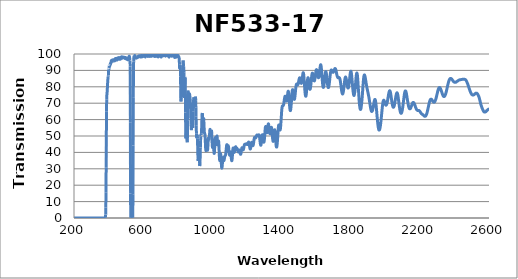
| Category | Transmission (%) |
|---|---|
| 2600.0 | 66.434 |
| 2599.0 | 66.421 |
| 2598.0 | 66.411 |
| 2597.0 | 66.37 |
| 2596.0 | 66.272 |
| 2595.0 | 66.179 |
| 2594.0 | 66.079 |
| 2593.0 | 65.983 |
| 2592.0 | 65.845 |
| 2591.0 | 65.765 |
| 2590.0 | 65.655 |
| 2589.0 | 65.601 |
| 2588.0 | 65.577 |
| 2587.0 | 65.482 |
| 2586.0 | 65.346 |
| 2585.0 | 65.191 |
| 2584.0 | 65.07 |
| 2583.0 | 64.915 |
| 2582.0 | 64.859 |
| 2581.0 | 64.767 |
| 2580.0 | 64.738 |
| 2579.0 | 64.683 |
| 2578.0 | 64.631 |
| 2577.0 | 64.623 |
| 2576.0 | 64.59 |
| 2575.0 | 64.598 |
| 2574.0 | 64.605 |
| 2573.0 | 64.634 |
| 2572.0 | 64.678 |
| 2571.0 | 64.774 |
| 2570.0 | 64.857 |
| 2569.0 | 65.033 |
| 2568.0 | 65.207 |
| 2567.0 | 65.389 |
| 2566.0 | 65.6 |
| 2565.0 | 65.81 |
| 2564.0 | 66.028 |
| 2563.0 | 66.29 |
| 2562.0 | 66.575 |
| 2561.0 | 66.826 |
| 2560.0 | 67.062 |
| 2559.0 | 67.328 |
| 2558.0 | 67.622 |
| 2557.0 | 67.91 |
| 2556.0 | 68.236 |
| 2555.0 | 68.53 |
| 2554.0 | 68.852 |
| 2553.0 | 69.226 |
| 2552.0 | 69.63 |
| 2551.0 | 70.064 |
| 2550.0 | 70.535 |
| 2549.0 | 70.997 |
| 2548.0 | 71.46 |
| 2547.0 | 71.886 |
| 2546.0 | 72.279 |
| 2545.0 | 72.675 |
| 2544.0 | 73.071 |
| 2543.0 | 73.428 |
| 2542.0 | 73.762 |
| 2541.0 | 74.049 |
| 2540.0 | 74.321 |
| 2539.0 | 74.558 |
| 2538.0 | 74.798 |
| 2537.0 | 75.017 |
| 2536.0 | 75.232 |
| 2535.0 | 75.435 |
| 2534.0 | 75.586 |
| 2533.0 | 75.68 |
| 2532.0 | 75.816 |
| 2531.0 | 75.972 |
| 2530.0 | 76.04 |
| 2529.0 | 76.068 |
| 2528.0 | 76.114 |
| 2527.0 | 76.123 |
| 2526.0 | 76.093 |
| 2525.0 | 76.093 |
| 2524.0 | 76.089 |
| 2523.0 | 76.062 |
| 2522.0 | 75.999 |
| 2521.0 | 75.884 |
| 2520.0 | 75.782 |
| 2519.0 | 75.693 |
| 2518.0 | 75.581 |
| 2517.0 | 75.5 |
| 2516.0 | 75.422 |
| 2515.0 | 75.315 |
| 2514.0 | 75.215 |
| 2513.0 | 75.152 |
| 2512.0 | 75.091 |
| 2511.0 | 75.052 |
| 2510.0 | 75.006 |
| 2509.0 | 74.962 |
| 2508.0 | 74.939 |
| 2507.0 | 74.938 |
| 2506.0 | 74.953 |
| 2505.0 | 75.004 |
| 2504.0 | 75.059 |
| 2503.0 | 75.132 |
| 2502.0 | 75.2 |
| 2501.0 | 75.283 |
| 2500.0 | 75.403 |
| 2499.0 | 75.562 |
| 2498.0 | 75.76 |
| 2497.0 | 75.947 |
| 2496.0 | 76.165 |
| 2495.0 | 76.369 |
| 2494.0 | 76.574 |
| 2493.0 | 76.79 |
| 2492.0 | 77.05 |
| 2491.0 | 77.321 |
| 2490.0 | 77.625 |
| 2489.0 | 77.936 |
| 2488.0 | 78.25 |
| 2487.0 | 78.537 |
| 2486.0 | 78.805 |
| 2485.0 | 79.115 |
| 2484.0 | 79.486 |
| 2483.0 | 79.818 |
| 2482.0 | 80.132 |
| 2481.0 | 80.444 |
| 2480.0 | 80.758 |
| 2479.0 | 81.055 |
| 2478.0 | 81.355 |
| 2477.0 | 81.637 |
| 2476.0 | 81.93 |
| 2475.0 | 82.203 |
| 2474.0 | 82.478 |
| 2473.0 | 82.719 |
| 2472.0 | 82.942 |
| 2471.0 | 83.151 |
| 2470.0 | 83.367 |
| 2469.0 | 83.612 |
| 2468.0 | 83.813 |
| 2467.0 | 83.938 |
| 2466.0 | 84.035 |
| 2465.0 | 84.149 |
| 2464.0 | 84.264 |
| 2463.0 | 84.37 |
| 2462.0 | 84.465 |
| 2461.0 | 84.518 |
| 2460.0 | 84.539 |
| 2459.0 | 84.569 |
| 2458.0 | 84.616 |
| 2457.0 | 84.636 |
| 2456.0 | 84.661 |
| 2455.0 | 84.658 |
| 2454.0 | 84.645 |
| 2453.0 | 84.64 |
| 2452.0 | 84.627 |
| 2451.0 | 84.613 |
| 2450.0 | 84.592 |
| 2449.0 | 84.587 |
| 2448.0 | 84.603 |
| 2447.0 | 84.599 |
| 2446.0 | 84.56 |
| 2445.0 | 84.529 |
| 2444.0 | 84.517 |
| 2443.0 | 84.516 |
| 2442.0 | 84.509 |
| 2441.0 | 84.491 |
| 2440.0 | 84.468 |
| 2439.0 | 84.43 |
| 2438.0 | 84.389 |
| 2437.0 | 84.36 |
| 2436.0 | 84.349 |
| 2435.0 | 84.354 |
| 2434.0 | 84.358 |
| 2433.0 | 84.343 |
| 2432.0 | 84.296 |
| 2431.0 | 84.261 |
| 2430.0 | 84.234 |
| 2429.0 | 84.196 |
| 2428.0 | 84.148 |
| 2427.0 | 84.099 |
| 2426.0 | 84.054 |
| 2425.0 | 84.013 |
| 2424.0 | 83.953 |
| 2423.0 | 83.88 |
| 2422.0 | 83.817 |
| 2421.0 | 83.74 |
| 2420.0 | 83.644 |
| 2419.0 | 83.565 |
| 2418.0 | 83.498 |
| 2417.0 | 83.429 |
| 2416.0 | 83.373 |
| 2415.0 | 83.31 |
| 2414.0 | 83.22 |
| 2413.0 | 83.133 |
| 2412.0 | 83.039 |
| 2411.0 | 82.941 |
| 2410.0 | 82.878 |
| 2409.0 | 82.847 |
| 2408.0 | 82.804 |
| 2407.0 | 82.774 |
| 2406.0 | 82.75 |
| 2405.0 | 82.709 |
| 2404.0 | 82.7 |
| 2403.0 | 82.714 |
| 2402.0 | 82.738 |
| 2401.0 | 82.771 |
| 2400.0 | 82.816 |
| 2399.0 | 82.879 |
| 2398.0 | 82.948 |
| 2397.0 | 83.026 |
| 2396.0 | 83.115 |
| 2395.0 | 83.217 |
| 2394.0 | 83.338 |
| 2393.0 | 83.478 |
| 2392.0 | 83.615 |
| 2391.0 | 83.748 |
| 2390.0 | 83.881 |
| 2389.0 | 84.023 |
| 2388.0 | 84.167 |
| 2387.0 | 84.329 |
| 2386.0 | 84.498 |
| 2385.0 | 84.638 |
| 2384.0 | 84.75 |
| 2383.0 | 84.833 |
| 2382.0 | 84.913 |
| 2381.0 | 85.001 |
| 2380.0 | 85.062 |
| 2379.0 | 85.103 |
| 2378.0 | 85.121 |
| 2377.0 | 85.108 |
| 2376.0 | 85.046 |
| 2375.0 | 84.941 |
| 2374.0 | 84.823 |
| 2373.0 | 84.702 |
| 2372.0 | 84.563 |
| 2371.0 | 84.377 |
| 2370.0 | 84.13 |
| 2369.0 | 83.846 |
| 2368.0 | 83.532 |
| 2367.0 | 83.193 |
| 2366.0 | 82.855 |
| 2365.0 | 82.492 |
| 2364.0 | 82.087 |
| 2363.0 | 81.673 |
| 2362.0 | 81.256 |
| 2361.0 | 80.802 |
| 2360.0 | 80.333 |
| 2359.0 | 79.852 |
| 2358.0 | 79.373 |
| 2357.0 | 78.897 |
| 2356.0 | 78.416 |
| 2355.0 | 77.975 |
| 2354.0 | 77.522 |
| 2353.0 | 77.078 |
| 2352.0 | 76.658 |
| 2351.0 | 76.265 |
| 2350.0 | 75.892 |
| 2349.0 | 75.546 |
| 2348.0 | 75.243 |
| 2347.0 | 74.993 |
| 2346.0 | 74.765 |
| 2345.0 | 74.557 |
| 2344.0 | 74.387 |
| 2343.0 | 74.244 |
| 2342.0 | 74.135 |
| 2341.0 | 74.063 |
| 2340.0 | 74.053 |
| 2339.0 | 74.085 |
| 2338.0 | 74.153 |
| 2337.0 | 74.242 |
| 2336.0 | 74.359 |
| 2335.0 | 74.496 |
| 2334.0 | 74.667 |
| 2333.0 | 74.882 |
| 2332.0 | 75.154 |
| 2331.0 | 75.424 |
| 2330.0 | 75.696 |
| 2329.0 | 75.983 |
| 2328.0 | 76.295 |
| 2327.0 | 76.618 |
| 2326.0 | 76.935 |
| 2325.0 | 77.264 |
| 2324.0 | 77.596 |
| 2323.0 | 77.926 |
| 2322.0 | 78.231 |
| 2321.0 | 78.498 |
| 2320.0 | 78.743 |
| 2319.0 | 78.975 |
| 2318.0 | 79.182 |
| 2317.0 | 79.339 |
| 2316.0 | 79.474 |
| 2315.0 | 79.559 |
| 2314.0 | 79.581 |
| 2313.0 | 79.551 |
| 2312.0 | 79.483 |
| 2311.0 | 79.365 |
| 2310.0 | 79.232 |
| 2309.0 | 79.049 |
| 2308.0 | 78.807 |
| 2307.0 | 78.511 |
| 2306.0 | 78.178 |
| 2305.0 | 77.792 |
| 2304.0 | 77.407 |
| 2303.0 | 77.005 |
| 2302.0 | 76.577 |
| 2301.0 | 76.127 |
| 2300.0 | 75.678 |
| 2299.0 | 75.244 |
| 2298.0 | 74.794 |
| 2297.0 | 74.326 |
| 2296.0 | 73.903 |
| 2295.0 | 73.494 |
| 2294.0 | 73.103 |
| 2293.0 | 72.698 |
| 2292.0 | 72.378 |
| 2291.0 | 72.061 |
| 2290.0 | 71.785 |
| 2289.0 | 71.52 |
| 2288.0 | 71.275 |
| 2287.0 | 71.067 |
| 2286.0 | 70.894 |
| 2285.0 | 70.77 |
| 2284.0 | 70.676 |
| 2283.0 | 70.623 |
| 2282.0 | 70.607 |
| 2281.0 | 70.619 |
| 2280.0 | 70.655 |
| 2279.0 | 70.721 |
| 2278.0 | 70.811 |
| 2277.0 | 70.926 |
| 2276.0 | 71.062 |
| 2275.0 | 71.22 |
| 2274.0 | 71.379 |
| 2273.0 | 71.546 |
| 2272.0 | 71.733 |
| 2271.0 | 71.912 |
| 2270.0 | 72.052 |
| 2269.0 | 72.2 |
| 2268.0 | 72.29 |
| 2267.0 | 72.368 |
| 2266.0 | 72.436 |
| 2265.0 | 72.458 |
| 2264.0 | 72.439 |
| 2263.0 | 72.363 |
| 2262.0 | 72.284 |
| 2261.0 | 72.157 |
| 2260.0 | 71.981 |
| 2259.0 | 71.756 |
| 2258.0 | 71.47 |
| 2257.0 | 71.141 |
| 2256.0 | 70.784 |
| 2255.0 | 70.396 |
| 2254.0 | 69.976 |
| 2253.0 | 69.54 |
| 2252.0 | 69.064 |
| 2251.0 | 68.568 |
| 2250.0 | 68.101 |
| 2249.0 | 67.613 |
| 2248.0 | 67.126 |
| 2247.0 | 66.649 |
| 2246.0 | 66.145 |
| 2245.0 | 65.664 |
| 2244.0 | 65.193 |
| 2243.0 | 64.769 |
| 2242.0 | 64.317 |
| 2241.0 | 63.988 |
| 2240.0 | 63.66 |
| 2239.0 | 63.351 |
| 2238.0 | 63.035 |
| 2237.0 | 62.779 |
| 2236.0 | 62.569 |
| 2235.0 | 62.388 |
| 2234.0 | 62.226 |
| 2233.0 | 62.117 |
| 2232.0 | 62.085 |
| 2231.0 | 62.055 |
| 2230.0 | 62.021 |
| 2229.0 | 62.001 |
| 2228.0 | 62.04 |
| 2227.0 | 62.096 |
| 2226.0 | 62.176 |
| 2225.0 | 62.241 |
| 2224.0 | 62.336 |
| 2223.0 | 62.42 |
| 2222.0 | 62.503 |
| 2221.0 | 62.616 |
| 2220.0 | 62.727 |
| 2219.0 | 62.82 |
| 2218.0 | 62.919 |
| 2217.0 | 63.002 |
| 2216.0 | 63.153 |
| 2215.0 | 63.21 |
| 2214.0 | 63.277 |
| 2213.0 | 63.35 |
| 2212.0 | 63.413 |
| 2211.0 | 63.51 |
| 2210.0 | 63.592 |
| 2209.0 | 63.669 |
| 2208.0 | 63.814 |
| 2207.0 | 63.918 |
| 2206.0 | 64.047 |
| 2205.0 | 64.206 |
| 2204.0 | 64.379 |
| 2203.0 | 64.547 |
| 2202.0 | 64.717 |
| 2201.0 | 64.89 |
| 2200.0 | 65.028 |
| 2199.0 | 65.172 |
| 2198.0 | 65.283 |
| 2197.0 | 65.401 |
| 2196.0 | 65.481 |
| 2195.0 | 65.521 |
| 2194.0 | 65.538 |
| 2193.0 | 65.584 |
| 2192.0 | 65.621 |
| 2191.0 | 65.595 |
| 2190.0 | 65.564 |
| 2189.0 | 65.545 |
| 2188.0 | 65.53 |
| 2187.0 | 65.574 |
| 2186.0 | 65.647 |
| 2185.0 | 65.713 |
| 2184.0 | 65.758 |
| 2183.0 | 65.851 |
| 2182.0 | 66.036 |
| 2181.0 | 66.202 |
| 2180.0 | 66.364 |
| 2179.0 | 66.59 |
| 2178.0 | 66.865 |
| 2177.0 | 67.11 |
| 2176.0 | 67.379 |
| 2175.0 | 67.653 |
| 2174.0 | 67.974 |
| 2173.0 | 68.317 |
| 2172.0 | 68.632 |
| 2171.0 | 68.913 |
| 2170.0 | 69.199 |
| 2169.0 | 69.468 |
| 2168.0 | 69.718 |
| 2167.0 | 69.967 |
| 2166.0 | 70.136 |
| 2165.0 | 70.285 |
| 2164.0 | 70.385 |
| 2163.0 | 70.432 |
| 2162.0 | 70.468 |
| 2161.0 | 70.453 |
| 2160.0 | 70.373 |
| 2159.0 | 70.253 |
| 2158.0 | 70.077 |
| 2157.0 | 69.864 |
| 2156.0 | 69.645 |
| 2155.0 | 69.357 |
| 2154.0 | 69.049 |
| 2153.0 | 68.742 |
| 2152.0 | 68.477 |
| 2151.0 | 68.192 |
| 2150.0 | 67.869 |
| 2149.0 | 67.58 |
| 2148.0 | 67.326 |
| 2147.0 | 67.091 |
| 2146.0 | 66.907 |
| 2145.0 | 66.74 |
| 2144.0 | 66.611 |
| 2143.0 | 66.56 |
| 2142.0 | 66.561 |
| 2141.0 | 66.586 |
| 2140.0 | 66.691 |
| 2139.0 | 66.857 |
| 2138.0 | 67.096 |
| 2137.0 | 67.382 |
| 2136.0 | 67.715 |
| 2135.0 | 68.099 |
| 2134.0 | 68.553 |
| 2133.0 | 69.09 |
| 2132.0 | 69.637 |
| 2131.0 | 70.23 |
| 2130.0 | 70.84 |
| 2129.0 | 71.486 |
| 2128.0 | 72.185 |
| 2127.0 | 72.841 |
| 2126.0 | 73.523 |
| 2125.0 | 74.196 |
| 2124.0 | 74.86 |
| 2123.0 | 75.491 |
| 2122.0 | 76.017 |
| 2121.0 | 76.491 |
| 2120.0 | 76.889 |
| 2119.0 | 77.22 |
| 2118.0 | 77.419 |
| 2117.0 | 77.497 |
| 2116.0 | 77.485 |
| 2115.0 | 77.328 |
| 2114.0 | 77.062 |
| 2113.0 | 76.692 |
| 2112.0 | 76.181 |
| 2111.0 | 75.58 |
| 2110.0 | 74.921 |
| 2109.0 | 74.189 |
| 2108.0 | 73.363 |
| 2107.0 | 72.519 |
| 2106.0 | 71.656 |
| 2105.0 | 70.773 |
| 2104.0 | 69.948 |
| 2103.0 | 69.087 |
| 2102.0 | 68.284 |
| 2101.0 | 67.513 |
| 2100.0 | 66.815 |
| 2099.0 | 66.179 |
| 2098.0 | 65.607 |
| 2097.0 | 65.077 |
| 2096.0 | 64.661 |
| 2095.0 | 64.33 |
| 2094.0 | 64.076 |
| 2093.0 | 63.884 |
| 2092.0 | 63.803 |
| 2091.0 | 63.831 |
| 2090.0 | 63.94 |
| 2089.0 | 64.138 |
| 2088.0 | 64.396 |
| 2087.0 | 64.751 |
| 2086.0 | 65.213 |
| 2085.0 | 65.773 |
| 2084.0 | 66.348 |
| 2083.0 | 67.015 |
| 2082.0 | 67.737 |
| 2081.0 | 68.504 |
| 2080.0 | 69.349 |
| 2079.0 | 70.169 |
| 2078.0 | 70.994 |
| 2077.0 | 71.815 |
| 2076.0 | 72.637 |
| 2075.0 | 73.432 |
| 2074.0 | 74.17 |
| 2073.0 | 74.789 |
| 2072.0 | 75.328 |
| 2071.0 | 75.766 |
| 2070.0 | 76.09 |
| 2069.0 | 76.297 |
| 2068.0 | 76.369 |
| 2067.0 | 76.305 |
| 2066.0 | 76.122 |
| 2065.0 | 75.836 |
| 2064.0 | 75.468 |
| 2063.0 | 75.017 |
| 2062.0 | 74.462 |
| 2061.0 | 73.865 |
| 2060.0 | 73.2 |
| 2059.0 | 72.549 |
| 2058.0 | 71.917 |
| 2057.0 | 71.258 |
| 2056.0 | 70.627 |
| 2055.0 | 70.002 |
| 2054.0 | 69.441 |
| 2053.0 | 68.967 |
| 2052.0 | 68.524 |
| 2051.0 | 68.151 |
| 2050.0 | 67.892 |
| 2049.0 | 67.699 |
| 2048.0 | 67.568 |
| 2047.0 | 67.524 |
| 2046.0 | 67.585 |
| 2045.0 | 67.756 |
| 2044.0 | 67.998 |
| 2043.0 | 68.322 |
| 2042.0 | 68.712 |
| 2041.0 | 69.21 |
| 2040.0 | 69.794 |
| 2039.0 | 70.4 |
| 2038.0 | 71.073 |
| 2037.0 | 71.792 |
| 2036.0 | 72.543 |
| 2035.0 | 73.286 |
| 2034.0 | 74.026 |
| 2033.0 | 74.721 |
| 2032.0 | 75.366 |
| 2031.0 | 76.001 |
| 2030.0 | 76.547 |
| 2029.0 | 76.97 |
| 2028.0 | 77.277 |
| 2027.0 | 77.485 |
| 2026.0 | 77.577 |
| 2025.0 | 77.543 |
| 2024.0 | 77.37 |
| 2023.0 | 77.099 |
| 2022.0 | 76.763 |
| 2021.0 | 76.301 |
| 2020.0 | 75.742 |
| 2019.0 | 75.15 |
| 2018.0 | 74.5 |
| 2017.0 | 73.852 |
| 2016.0 | 73.233 |
| 2015.0 | 72.597 |
| 2014.0 | 71.946 |
| 2013.0 | 71.332 |
| 2012.0 | 70.807 |
| 2011.0 | 70.337 |
| 2010.0 | 69.901 |
| 2009.0 | 69.523 |
| 2008.0 | 69.228 |
| 2007.0 | 68.993 |
| 2006.0 | 68.843 |
| 2005.0 | 68.781 |
| 2004.0 | 68.788 |
| 2003.0 | 68.861 |
| 2002.0 | 69.017 |
| 2001.0 | 69.259 |
| 2000.0 | 69.531 |
| 1999.0 | 69.833 |
| 1998.0 | 70.182 |
| 1997.0 | 70.52 |
| 1996.0 | 70.875 |
| 1995.0 | 71.213 |
| 1994.0 | 71.477 |
| 1993.0 | 71.678 |
| 1992.0 | 71.808 |
| 1991.0 | 71.817 |
| 1990.0 | 71.73 |
| 1989.0 | 71.51 |
| 1988.0 | 71.164 |
| 1987.0 | 70.683 |
| 1986.0 | 70.055 |
| 1985.0 | 69.314 |
| 1984.0 | 68.463 |
| 1983.0 | 67.507 |
| 1982.0 | 66.491 |
| 1981.0 | 65.416 |
| 1980.0 | 64.297 |
| 1979.0 | 63.177 |
| 1978.0 | 62.081 |
| 1977.0 | 60.995 |
| 1976.0 | 59.949 |
| 1975.0 | 58.958 |
| 1974.0 | 58.016 |
| 1973.0 | 57.122 |
| 1972.0 | 56.316 |
| 1971.0 | 55.622 |
| 1970.0 | 55.023 |
| 1969.0 | 54.503 |
| 1968.0 | 54.098 |
| 1967.0 | 53.823 |
| 1966.0 | 53.657 |
| 1965.0 | 53.588 |
| 1964.0 | 53.616 |
| 1963.0 | 53.795 |
| 1962.0 | 54.088 |
| 1961.0 | 54.508 |
| 1960.0 | 55.067 |
| 1959.0 | 55.683 |
| 1958.0 | 56.439 |
| 1957.0 | 57.363 |
| 1956.0 | 58.348 |
| 1955.0 | 59.395 |
| 1954.0 | 60.491 |
| 1953.0 | 61.668 |
| 1952.0 | 62.963 |
| 1951.0 | 64.165 |
| 1950.0 | 65.41 |
| 1949.0 | 66.58 |
| 1948.0 | 67.756 |
| 1947.0 | 68.81 |
| 1946.0 | 69.762 |
| 1945.0 | 70.564 |
| 1944.0 | 71.238 |
| 1943.0 | 71.775 |
| 1942.0 | 72.152 |
| 1941.0 | 72.301 |
| 1940.0 | 72.272 |
| 1939.0 | 72.122 |
| 1938.0 | 71.835 |
| 1937.0 | 71.473 |
| 1936.0 | 71.025 |
| 1935.0 | 70.51 |
| 1934.0 | 69.902 |
| 1933.0 | 69.296 |
| 1932.0 | 68.646 |
| 1931.0 | 68.062 |
| 1930.0 | 67.45 |
| 1929.0 | 66.86 |
| 1928.0 | 66.335 |
| 1927.0 | 65.877 |
| 1926.0 | 65.509 |
| 1925.0 | 65.235 |
| 1924.0 | 65.077 |
| 1923.0 | 64.995 |
| 1922.0 | 64.969 |
| 1921.0 | 65.018 |
| 1920.0 | 65.14 |
| 1919.0 | 65.404 |
| 1918.0 | 65.782 |
| 1917.0 | 66.241 |
| 1916.0 | 66.739 |
| 1915.0 | 67.268 |
| 1914.0 | 67.899 |
| 1913.0 | 68.514 |
| 1912.0 | 69.199 |
| 1911.0 | 69.906 |
| 1910.0 | 70.59 |
| 1909.0 | 71.242 |
| 1908.0 | 71.904 |
| 1907.0 | 72.575 |
| 1906.0 | 73.286 |
| 1905.0 | 73.915 |
| 1904.0 | 74.449 |
| 1903.0 | 74.986 |
| 1902.0 | 75.509 |
| 1901.0 | 76.011 |
| 1900.0 | 76.558 |
| 1899.0 | 77.039 |
| 1898.0 | 77.465 |
| 1897.0 | 78.019 |
| 1896.0 | 78.476 |
| 1895.0 | 78.941 |
| 1894.0 | 79.53 |
| 1893.0 | 80.091 |
| 1892.0 | 80.671 |
| 1891.0 | 81.301 |
| 1890.0 | 81.906 |
| 1889.0 | 82.562 |
| 1888.0 | 83.262 |
| 1887.0 | 83.926 |
| 1886.0 | 84.545 |
| 1885.0 | 85.2 |
| 1884.0 | 85.785 |
| 1883.0 | 86.347 |
| 1882.0 | 86.708 |
| 1881.0 | 87.014 |
| 1880.0 | 87.212 |
| 1879.0 | 87.221 |
| 1878.0 | 87.023 |
| 1877.0 | 86.608 |
| 1876.0 | 86.068 |
| 1875.0 | 85.22 |
| 1874.0 | 84.229 |
| 1873.0 | 83.011 |
| 1872.0 | 81.557 |
| 1871.0 | 80.185 |
| 1870.0 | 78.62 |
| 1869.0 | 77.038 |
| 1868.0 | 75.531 |
| 1867.0 | 74.104 |
| 1866.0 | 72.822 |
| 1865.0 | 71.669 |
| 1864.0 | 70.581 |
| 1863.0 | 69.6 |
| 1862.0 | 68.718 |
| 1861.0 | 67.833 |
| 1860.0 | 67.092 |
| 1859.0 | 66.547 |
| 1858.0 | 66.245 |
| 1857.0 | 66.178 |
| 1856.0 | 66.251 |
| 1855.0 | 66.495 |
| 1854.0 | 66.982 |
| 1853.0 | 67.579 |
| 1852.0 | 68.367 |
| 1851.0 | 69.251 |
| 1850.0 | 70.198 |
| 1849.0 | 71.586 |
| 1848.0 | 73.199 |
| 1847.0 | 74.99 |
| 1846.0 | 76.672 |
| 1845.0 | 78.016 |
| 1844.0 | 79.572 |
| 1843.0 | 81.242 |
| 1842.0 | 82.927 |
| 1841.0 | 84.546 |
| 1840.0 | 85.852 |
| 1839.0 | 86.987 |
| 1838.0 | 87.685 |
| 1837.0 | 88.208 |
| 1836.0 | 88.392 |
| 1835.0 | 88.289 |
| 1834.0 | 87.967 |
| 1833.0 | 87.345 |
| 1832.0 | 86.442 |
| 1831.0 | 85.343 |
| 1830.0 | 84.065 |
| 1829.0 | 82.678 |
| 1828.0 | 81.44 |
| 1827.0 | 80.111 |
| 1826.0 | 78.805 |
| 1825.0 | 77.794 |
| 1824.0 | 76.93 |
| 1823.0 | 76.303 |
| 1822.0 | 75.681 |
| 1821.0 | 75.135 |
| 1820.0 | 74.778 |
| 1819.0 | 74.711 |
| 1818.0 | 74.885 |
| 1817.0 | 75.201 |
| 1816.0 | 75.762 |
| 1815.0 | 76.465 |
| 1814.0 | 77.229 |
| 1813.0 | 78.187 |
| 1812.0 | 79.305 |
| 1811.0 | 80.488 |
| 1810.0 | 81.771 |
| 1809.0 | 83.065 |
| 1808.0 | 84.247 |
| 1807.0 | 85.39 |
| 1806.0 | 86.539 |
| 1805.0 | 87.526 |
| 1804.0 | 88.373 |
| 1803.0 | 88.99 |
| 1802.0 | 89.381 |
| 1801.0 | 89.47 |
| 1800.0 | 89.261 |
| 1799.0 | 88.946 |
| 1798.0 | 88.373 |
| 1797.0 | 87.711 |
| 1796.0 | 86.823 |
| 1795.0 | 85.855 |
| 1794.0 | 84.838 |
| 1793.0 | 83.825 |
| 1792.0 | 82.825 |
| 1791.0 | 81.928 |
| 1790.0 | 81.114 |
| 1789.0 | 80.456 |
| 1788.0 | 79.925 |
| 1787.0 | 79.547 |
| 1786.0 | 79.301 |
| 1785.0 | 79.218 |
| 1784.0 | 79.295 |
| 1783.0 | 79.544 |
| 1782.0 | 79.907 |
| 1781.0 | 80.443 |
| 1780.0 | 81.058 |
| 1779.0 | 81.677 |
| 1778.0 | 82.433 |
| 1777.0 | 83.113 |
| 1776.0 | 83.823 |
| 1775.0 | 84.465 |
| 1774.0 | 84.995 |
| 1773.0 | 85.428 |
| 1772.0 | 85.746 |
| 1771.0 | 85.913 |
| 1770.0 | 85.947 |
| 1769.0 | 85.75 |
| 1768.0 | 85.396 |
| 1767.0 | 84.857 |
| 1766.0 | 84.174 |
| 1765.0 | 83.388 |
| 1764.0 | 82.518 |
| 1763.0 | 81.603 |
| 1762.0 | 80.682 |
| 1761.0 | 79.761 |
| 1760.0 | 78.866 |
| 1759.0 | 78.047 |
| 1758.0 | 77.319 |
| 1757.0 | 76.714 |
| 1756.0 | 76.202 |
| 1755.0 | 75.86 |
| 1754.0 | 75.661 |
| 1753.0 | 75.619 |
| 1752.0 | 75.75 |
| 1751.0 | 75.998 |
| 1750.0 | 76.368 |
| 1749.0 | 76.883 |
| 1748.0 | 77.483 |
| 1747.0 | 78.184 |
| 1746.0 | 78.949 |
| 1745.0 | 79.765 |
| 1744.0 | 80.6 |
| 1743.0 | 81.417 |
| 1742.0 | 82.215 |
| 1741.0 | 82.939 |
| 1740.0 | 83.616 |
| 1739.0 | 84.174 |
| 1738.0 | 84.644 |
| 1737.0 | 85.017 |
| 1736.0 | 85.289 |
| 1735.0 | 85.461 |
| 1734.0 | 85.571 |
| 1733.0 | 85.62 |
| 1732.0 | 85.619 |
| 1731.0 | 85.585 |
| 1730.0 | 85.54 |
| 1729.0 | 85.513 |
| 1728.0 | 85.517 |
| 1727.0 | 85.519 |
| 1726.0 | 85.607 |
| 1725.0 | 85.729 |
| 1724.0 | 85.95 |
| 1723.0 | 86.234 |
| 1722.0 | 86.575 |
| 1721.0 | 86.963 |
| 1720.0 | 87.435 |
| 1719.0 | 87.965 |
| 1718.0 | 88.486 |
| 1717.0 | 88.994 |
| 1716.0 | 89.503 |
| 1715.0 | 89.994 |
| 1714.0 | 90.405 |
| 1713.0 | 90.72 |
| 1712.0 | 90.961 |
| 1711.0 | 91.08 |
| 1710.0 | 91.144 |
| 1709.0 | 91.102 |
| 1708.0 | 90.952 |
| 1707.0 | 90.742 |
| 1706.0 | 90.474 |
| 1705.0 | 90.173 |
| 1704.0 | 89.854 |
| 1703.0 | 89.561 |
| 1702.0 | 89.296 |
| 1701.0 | 89.08 |
| 1700.0 | 88.918 |
| 1699.0 | 88.837 |
| 1698.0 | 88.819 |
| 1697.0 | 88.846 |
| 1696.0 | 88.936 |
| 1695.0 | 89.087 |
| 1694.0 | 89.302 |
| 1693.0 | 89.54 |
| 1692.0 | 89.787 |
| 1691.0 | 90.011 |
| 1690.0 | 90.157 |
| 1689.0 | 90.248 |
| 1688.0 | 90.253 |
| 1687.0 | 90.127 |
| 1686.0 | 89.863 |
| 1685.0 | 89.46 |
| 1684.0 | 88.913 |
| 1683.0 | 88.236 |
| 1682.0 | 87.438 |
| 1681.0 | 86.526 |
| 1680.0 | 85.566 |
| 1679.0 | 84.597 |
| 1678.0 | 83.596 |
| 1677.0 | 82.641 |
| 1676.0 | 81.754 |
| 1675.0 | 80.992 |
| 1674.0 | 80.364 |
| 1673.0 | 79.888 |
| 1672.0 | 79.599 |
| 1671.0 | 79.499 |
| 1670.0 | 79.597 |
| 1669.0 | 79.876 |
| 1668.0 | 80.343 |
| 1667.0 | 80.981 |
| 1666.0 | 81.763 |
| 1665.0 | 82.678 |
| 1664.0 | 83.695 |
| 1663.0 | 84.734 |
| 1662.0 | 85.77 |
| 1661.0 | 86.751 |
| 1660.0 | 87.628 |
| 1659.0 | 88.36 |
| 1658.0 | 88.897 |
| 1657.0 | 89.194 |
| 1656.0 | 89.256 |
| 1655.0 | 89.078 |
| 1654.0 | 88.664 |
| 1653.0 | 88.033 |
| 1652.0 | 87.231 |
| 1651.0 | 86.297 |
| 1650.0 | 85.25 |
| 1649.0 | 84.178 |
| 1648.0 | 83.152 |
| 1647.0 | 82.161 |
| 1646.0 | 81.297 |
| 1645.0 | 80.618 |
| 1644.0 | 80.082 |
| 1643.0 | 79.729 |
| 1642.0 | 79.601 |
| 1641.0 | 79.723 |
| 1640.0 | 80.107 |
| 1639.0 | 80.737 |
| 1638.0 | 81.592 |
| 1637.0 | 82.629 |
| 1636.0 | 83.837 |
| 1635.0 | 85.19 |
| 1634.0 | 86.602 |
| 1633.0 | 88.055 |
| 1632.0 | 89.475 |
| 1631.0 | 90.744 |
| 1630.0 | 91.819 |
| 1629.0 | 92.643 |
| 1628.0 | 93.181 |
| 1627.0 | 93.437 |
| 1626.0 | 93.39 |
| 1625.0 | 93.049 |
| 1624.0 | 92.467 |
| 1623.0 | 91.737 |
| 1622.0 | 90.868 |
| 1621.0 | 89.895 |
| 1620.0 | 88.94 |
| 1619.0 | 88.031 |
| 1618.0 | 87.219 |
| 1617.0 | 86.541 |
| 1616.0 | 86.02 |
| 1615.0 | 85.668 |
| 1614.0 | 85.52 |
| 1613.0 | 85.544 |
| 1612.0 | 85.753 |
| 1611.0 | 86.119 |
| 1610.0 | 86.615 |
| 1609.0 | 87.215 |
| 1608.0 | 87.841 |
| 1607.0 | 88.503 |
| 1606.0 | 89.156 |
| 1605.0 | 89.704 |
| 1604.0 | 90.136 |
| 1603.0 | 90.41 |
| 1602.0 | 90.46 |
| 1601.0 | 90.303 |
| 1600.0 | 89.959 |
| 1599.0 | 89.42 |
| 1598.0 | 88.727 |
| 1597.0 | 87.945 |
| 1596.0 | 87.1 |
| 1595.0 | 86.232 |
| 1594.0 | 85.451 |
| 1593.0 | 84.751 |
| 1592.0 | 84.178 |
| 1591.0 | 83.788 |
| 1590.0 | 83.61 |
| 1589.0 | 83.618 |
| 1588.0 | 83.778 |
| 1587.0 | 84.138 |
| 1586.0 | 84.655 |
| 1585.0 | 85.287 |
| 1584.0 | 85.995 |
| 1583.0 | 86.672 |
| 1582.0 | 87.286 |
| 1581.0 | 87.807 |
| 1580.0 | 88.17 |
| 1579.0 | 88.329 |
| 1578.0 | 88.253 |
| 1577.0 | 87.965 |
| 1576.0 | 87.434 |
| 1575.0 | 86.68 |
| 1574.0 | 85.771 |
| 1573.0 | 84.748 |
| 1572.0 | 83.645 |
| 1571.0 | 82.53 |
| 1570.0 | 81.477 |
| 1569.0 | 80.524 |
| 1568.0 | 79.72 |
| 1567.0 | 79.078 |
| 1566.0 | 78.65 |
| 1565.0 | 78.461 |
| 1564.0 | 78.54 |
| 1563.0 | 78.81 |
| 1562.0 | 79.303 |
| 1561.0 | 80.008 |
| 1560.0 | 80.844 |
| 1559.0 | 81.846 |
| 1558.0 | 82.85 |
| 1557.0 | 83.777 |
| 1556.0 | 84.595 |
| 1555.0 | 85.18 |
| 1554.0 | 85.517 |
| 1553.0 | 85.551 |
| 1552.0 | 85.262 |
| 1551.0 | 84.611 |
| 1550.0 | 83.746 |
| 1549.0 | 82.608 |
| 1548.0 | 81.308 |
| 1547.0 | 79.922 |
| 1546.0 | 78.563 |
| 1545.0 | 77.319 |
| 1544.0 | 76.232 |
| 1543.0 | 75.345 |
| 1542.0 | 74.695 |
| 1541.0 | 74.303 |
| 1540.0 | 74.241 |
| 1539.0 | 74.474 |
| 1538.0 | 74.985 |
| 1537.0 | 75.761 |
| 1536.0 | 76.794 |
| 1535.0 | 78.061 |
| 1534.0 | 79.46 |
| 1533.0 | 80.999 |
| 1532.0 | 82.592 |
| 1531.0 | 84.095 |
| 1530.0 | 85.522 |
| 1529.0 | 86.729 |
| 1528.0 | 87.681 |
| 1527.0 | 88.323 |
| 1526.0 | 88.607 |
| 1525.0 | 88.559 |
| 1524.0 | 88.181 |
| 1523.0 | 87.562 |
| 1522.0 | 86.747 |
| 1521.0 | 85.858 |
| 1520.0 | 84.952 |
| 1519.0 | 84.035 |
| 1518.0 | 83.301 |
| 1517.0 | 82.714 |
| 1516.0 | 82.311 |
| 1515.0 | 82.118 |
| 1514.0 | 82.146 |
| 1513.0 | 82.356 |
| 1512.0 | 82.703 |
| 1511.0 | 83.144 |
| 1510.0 | 83.716 |
| 1509.0 | 84.27 |
| 1508.0 | 84.777 |
| 1507.0 | 85.218 |
| 1506.0 | 85.446 |
| 1505.0 | 85.499 |
| 1504.0 | 85.392 |
| 1503.0 | 85.141 |
| 1502.0 | 84.696 |
| 1501.0 | 84.191 |
| 1500.0 | 83.611 |
| 1499.0 | 83.055 |
| 1498.0 | 82.497 |
| 1497.0 | 82.003 |
| 1496.0 | 81.61 |
| 1495.0 | 81.33 |
| 1494.0 | 81.193 |
| 1493.0 | 81.157 |
| 1492.0 | 81.196 |
| 1491.0 | 81.36 |
| 1490.0 | 81.503 |
| 1489.0 | 81.632 |
| 1488.0 | 81.715 |
| 1487.0 | 81.648 |
| 1486.0 | 81.424 |
| 1485.0 | 80.958 |
| 1484.0 | 80.391 |
| 1483.0 | 79.622 |
| 1482.0 | 78.68 |
| 1481.0 | 77.585 |
| 1480.0 | 76.472 |
| 1479.0 | 75.336 |
| 1478.0 | 74.396 |
| 1477.0 | 73.524 |
| 1476.0 | 72.859 |
| 1475.0 | 72.431 |
| 1474.0 | 72.304 |
| 1473.0 | 72.409 |
| 1472.0 | 72.776 |
| 1471.0 | 73.366 |
| 1470.0 | 74.151 |
| 1469.0 | 75.066 |
| 1468.0 | 75.992 |
| 1467.0 | 76.938 |
| 1466.0 | 77.64 |
| 1465.0 | 78.12 |
| 1464.0 | 78.253 |
| 1463.0 | 78.013 |
| 1462.0 | 77.467 |
| 1461.0 | 76.485 |
| 1460.0 | 75.212 |
| 1459.0 | 73.725 |
| 1458.0 | 72.075 |
| 1457.0 | 70.661 |
| 1456.0 | 69.184 |
| 1455.0 | 67.88 |
| 1454.0 | 66.826 |
| 1453.0 | 66.041 |
| 1452.0 | 65.577 |
| 1451.0 | 65.477 |
| 1450.0 | 65.668 |
| 1449.0 | 66.199 |
| 1448.0 | 67.047 |
| 1447.0 | 68.24 |
| 1446.0 | 69.584 |
| 1445.0 | 71.089 |
| 1444.0 | 72.546 |
| 1443.0 | 73.971 |
| 1442.0 | 75.271 |
| 1441.0 | 76.343 |
| 1440.0 | 77.024 |
| 1439.0 | 77.32 |
| 1438.0 | 77.185 |
| 1437.0 | 76.675 |
| 1436.0 | 75.91 |
| 1435.0 | 75.01 |
| 1434.0 | 74.063 |
| 1433.0 | 73.143 |
| 1432.0 | 72.387 |
| 1431.0 | 71.777 |
| 1430.0 | 71.429 |
| 1429.0 | 71.323 |
| 1428.0 | 71.447 |
| 1427.0 | 71.772 |
| 1426.0 | 72.225 |
| 1425.0 | 72.779 |
| 1424.0 | 73.341 |
| 1423.0 | 73.824 |
| 1422.0 | 74.124 |
| 1421.0 | 74.261 |
| 1420.0 | 74.163 |
| 1419.0 | 73.787 |
| 1418.0 | 73.209 |
| 1417.0 | 72.571 |
| 1416.0 | 71.879 |
| 1415.0 | 71.118 |
| 1414.0 | 70.32 |
| 1413.0 | 69.59 |
| 1412.0 | 69.072 |
| 1411.0 | 68.774 |
| 1410.0 | 68.591 |
| 1409.0 | 68.513 |
| 1408.0 | 68.442 |
| 1407.0 | 68.433 |
| 1406.0 | 68.38 |
| 1405.0 | 68.215 |
| 1404.0 | 67.807 |
| 1403.0 | 67.178 |
| 1402.0 | 66.42 |
| 1401.0 | 65.221 |
| 1400.0 | 63.589 |
| 1399.0 | 61.774 |
| 1398.0 | 60.282 |
| 1397.0 | 58.952 |
| 1396.0 | 57.382 |
| 1395.0 | 55.827 |
| 1394.0 | 54.762 |
| 1393.0 | 54.057 |
| 1392.0 | 53.71 |
| 1391.0 | 53.65 |
| 1390.0 | 53.914 |
| 1389.0 | 54.435 |
| 1388.0 | 55.103 |
| 1387.0 | 55.722 |
| 1386.0 | 56.142 |
| 1385.0 | 56.545 |
| 1384.0 | 56.662 |
| 1383.0 | 56.227 |
| 1382.0 | 55.302 |
| 1381.0 | 53.882 |
| 1380.0 | 52.417 |
| 1379.0 | 50.884 |
| 1378.0 | 49.279 |
| 1377.0 | 47.779 |
| 1376.0 | 46.347 |
| 1375.0 | 45.138 |
| 1374.0 | 44.165 |
| 1373.0 | 43.544 |
| 1372.0 | 43.255 |
| 1371.0 | 43.273 |
| 1370.0 | 43.594 |
| 1369.0 | 44.26 |
| 1368.0 | 45.355 |
| 1367.0 | 46.686 |
| 1366.0 | 48.084 |
| 1365.0 | 49.76 |
| 1364.0 | 51.251 |
| 1363.0 | 52.449 |
| 1362.0 | 53.437 |
| 1361.0 | 53.807 |
| 1360.0 | 53.62 |
| 1359.0 | 52.979 |
| 1358.0 | 52.063 |
| 1357.0 | 51.125 |
| 1356.0 | 50.007 |
| 1355.0 | 48.819 |
| 1354.0 | 47.711 |
| 1353.0 | 47.04 |
| 1352.0 | 46.754 |
| 1351.0 | 46.883 |
| 1350.0 | 47.391 |
| 1349.0 | 48.148 |
| 1348.0 | 49.147 |
| 1347.0 | 50.383 |
| 1346.0 | 51.74 |
| 1345.0 | 53.046 |
| 1344.0 | 54.108 |
| 1343.0 | 54.862 |
| 1342.0 | 55.268 |
| 1341.0 | 55.286 |
| 1340.0 | 54.946 |
| 1339.0 | 54.34 |
| 1338.0 | 53.57 |
| 1337.0 | 52.799 |
| 1336.0 | 52.148 |
| 1335.0 | 51.619 |
| 1334.0 | 51.334 |
| 1333.0 | 51.34 |
| 1332.0 | 51.645 |
| 1331.0 | 52.236 |
| 1330.0 | 53.079 |
| 1329.0 | 54.061 |
| 1328.0 | 55.071 |
| 1327.0 | 56.049 |
| 1326.0 | 56.826 |
| 1325.0 | 57.307 |
| 1324.0 | 57.4 |
| 1323.0 | 57.114 |
| 1322.0 | 56.466 |
| 1321.0 | 55.572 |
| 1320.0 | 54.567 |
| 1319.0 | 53.598 |
| 1318.0 | 52.829 |
| 1317.0 | 52.266 |
| 1316.0 | 51.99 |
| 1315.0 | 52.043 |
| 1314.0 | 52.393 |
| 1313.0 | 53.011 |
| 1312.0 | 53.802 |
| 1311.0 | 54.636 |
| 1310.0 | 55.317 |
| 1309.0 | 55.729 |
| 1308.0 | 55.773 |
| 1307.0 | 55.39 |
| 1306.0 | 54.584 |
| 1305.0 | 53.392 |
| 1304.0 | 52.003 |
| 1303.0 | 50.552 |
| 1302.0 | 49.161 |
| 1301.0 | 47.973 |
| 1300.0 | 47.052 |
| 1299.0 | 46.468 |
| 1298.0 | 46.237 |
| 1297.0 | 46.322 |
| 1296.0 | 46.71 |
| 1295.0 | 47.344 |
| 1294.0 | 48.151 |
| 1293.0 | 49.029 |
| 1292.0 | 49.825 |
| 1291.0 | 50.431 |
| 1290.0 | 50.756 |
| 1289.0 | 50.729 |
| 1288.0 | 50.336 |
| 1287.0 | 49.619 |
| 1286.0 | 48.663 |
| 1285.0 | 47.554 |
| 1284.0 | 46.47 |
| 1283.0 | 45.566 |
| 1282.0 | 44.866 |
| 1281.0 | 44.461 |
| 1280.0 | 44.368 |
| 1279.0 | 44.571 |
| 1278.0 | 45.065 |
| 1277.0 | 45.807 |
| 1276.0 | 46.703 |
| 1275.0 | 47.63 |
| 1274.0 | 48.537 |
| 1273.0 | 49.392 |
| 1272.0 | 50.036 |
| 1271.0 | 50.474 |
| 1270.0 | 50.684 |
| 1269.0 | 50.677 |
| 1268.0 | 50.525 |
| 1267.0 | 50.33 |
| 1266.0 | 50.183 |
| 1265.0 | 50.105 |
| 1264.0 | 50.084 |
| 1263.0 | 50.132 |
| 1262.0 | 50.242 |
| 1261.0 | 50.399 |
| 1260.0 | 50.541 |
| 1259.0 | 50.621 |
| 1258.0 | 50.615 |
| 1257.0 | 50.496 |
| 1256.0 | 50.285 |
| 1255.0 | 49.997 |
| 1254.0 | 49.656 |
| 1253.0 | 49.318 |
| 1252.0 | 49.048 |
| 1251.0 | 48.87 |
| 1250.0 | 48.774 |
| 1249.0 | 48.778 |
| 1248.0 | 48.875 |
| 1247.0 | 49.021 |
| 1246.0 | 49.149 |
| 1245.0 | 49.195 |
| 1244.0 | 49.08 |
| 1243.0 | 48.781 |
| 1242.0 | 48.295 |
| 1241.0 | 47.615 |
| 1240.0 | 46.835 |
| 1239.0 | 46.047 |
| 1238.0 | 45.325 |
| 1237.0 | 44.732 |
| 1236.0 | 44.308 |
| 1235.0 | 44.112 |
| 1234.0 | 44.171 |
| 1233.0 | 44.43 |
| 1232.0 | 44.837 |
| 1231.0 | 45.322 |
| 1230.0 | 45.779 |
| 1229.0 | 46.103 |
| 1228.0 | 46.204 |
| 1227.0 | 46.049 |
| 1226.0 | 45.644 |
| 1225.0 | 45.034 |
| 1224.0 | 44.303 |
| 1223.0 | 43.585 |
| 1222.0 | 42.929 |
| 1221.0 | 42.41 |
| 1220.0 | 42.109 |
| 1219.0 | 42.065 |
| 1218.0 | 42.254 |
| 1217.0 | 42.656 |
| 1216.0 | 43.279 |
| 1215.0 | 43.994 |
| 1214.0 | 44.722 |
| 1213.0 | 45.382 |
| 1212.0 | 45.905 |
| 1211.0 | 46.236 |
| 1210.0 | 46.342 |
| 1209.0 | 46.236 |
| 1208.0 | 45.985 |
| 1207.0 | 45.649 |
| 1206.0 | 45.313 |
| 1205.0 | 45.017 |
| 1204.0 | 44.826 |
| 1203.0 | 44.749 |
| 1202.0 | 44.766 |
| 1201.0 | 44.884 |
| 1200.0 | 45.057 |
| 1199.0 | 45.215 |
| 1198.0 | 45.291 |
| 1197.0 | 45.301 |
| 1196.0 | 45.258 |
| 1195.0 | 45.175 |
| 1194.0 | 45.058 |
| 1193.0 | 44.954 |
| 1192.0 | 44.886 |
| 1191.0 | 44.867 |
| 1190.0 | 44.901 |
| 1189.0 | 44.949 |
| 1188.0 | 44.977 |
| 1187.0 | 44.923 |
| 1186.0 | 44.742 |
| 1185.0 | 44.431 |
| 1184.0 | 43.993 |
| 1183.0 | 43.461 |
| 1182.0 | 42.887 |
| 1181.0 | 42.345 |
| 1180.0 | 41.908 |
| 1179.0 | 41.627 |
| 1178.0 | 41.54 |
| 1177.0 | 41.621 |
| 1176.0 | 41.856 |
| 1175.0 | 42.181 |
| 1174.0 | 42.543 |
| 1173.0 | 42.811 |
| 1172.0 | 42.911 |
| 1171.0 | 42.796 |
| 1170.0 | 42.445 |
| 1169.0 | 41.877 |
| 1168.0 | 41.174 |
| 1167.0 | 40.442 |
| 1166.0 | 39.693 |
| 1165.0 | 39.16 |
| 1164.0 | 38.873 |
| 1163.0 | 38.848 |
| 1162.0 | 39.062 |
| 1161.0 | 39.467 |
| 1160.0 | 40.01 |
| 1159.0 | 40.564 |
| 1158.0 | 41.055 |
| 1157.0 | 41.371 |
| 1156.0 | 41.465 |
| 1155.0 | 41.371 |
| 1154.0 | 41.105 |
| 1153.0 | 40.78 |
| 1152.0 | 40.453 |
| 1151.0 | 40.254 |
| 1150.0 | 40.238 |
| 1149.0 | 40.388 |
| 1148.0 | 40.691 |
| 1147.0 | 41.096 |
| 1146.0 | 41.535 |
| 1145.0 | 41.905 |
| 1144.0 | 42.214 |
| 1143.0 | 42.408 |
| 1142.0 | 42.536 |
| 1141.0 | 42.617 |
| 1140.0 | 42.679 |
| 1139.0 | 42.769 |
| 1138.0 | 42.899 |
| 1137.0 | 43.106 |
| 1136.0 | 43.329 |
| 1135.0 | 43.452 |
| 1134.0 | 43.385 |
| 1133.0 | 43.17 |
| 1132.0 | 42.775 |
| 1131.0 | 42.246 |
| 1130.0 | 41.612 |
| 1129.0 | 40.889 |
| 1128.0 | 40.326 |
| 1127.0 | 40.008 |
| 1126.0 | 40.001 |
| 1125.0 | 40.296 |
| 1124.0 | 40.833 |
| 1123.0 | 41.55 |
| 1122.0 | 42.261 |
| 1121.0 | 42.677 |
| 1120.0 | 42.625 |
| 1119.0 | 42.013 |
| 1118.0 | 40.915 |
| 1117.0 | 39.438 |
| 1116.0 | 37.868 |
| 1115.0 | 36.508 |
| 1114.0 | 35.507 |
| 1113.0 | 34.981 |
| 1112.0 | 34.957 |
| 1111.0 | 35.435 |
| 1110.0 | 36.31 |
| 1109.0 | 37.43 |
| 1108.0 | 38.622 |
| 1107.0 | 39.584 |
| 1106.0 | 40.119 |
| 1105.0 | 40.232 |
| 1104.0 | 39.943 |
| 1103.0 | 39.388 |
| 1102.0 | 38.799 |
| 1101.0 | 38.387 |
| 1100.0 | 38.281 |
| 1099.0 | 38.537 |
| 1098.0 | 39.162 |
| 1097.0 | 40.068 |
| 1096.0 | 41.126 |
| 1095.0 | 42.168 |
| 1094.0 | 43.095 |
| 1093.0 | 43.705 |
| 1092.0 | 44.027 |
| 1091.0 | 44.074 |
| 1090.0 | 43.948 |
| 1089.0 | 43.883 |
| 1088.0 | 43.936 |
| 1087.0 | 44.114 |
| 1086.0 | 44.392 |
| 1085.0 | 44.639 |
| 1084.0 | 44.716 |
| 1083.0 | 44.397 |
| 1082.0 | 43.755 |
| 1081.0 | 42.776 |
| 1080.0 | 41.588 |
| 1079.0 | 40.431 |
| 1078.0 | 39.438 |
| 1077.0 | 38.737 |
| 1076.0 | 38.275 |
| 1075.0 | 38.099 |
| 1074.0 | 38.042 |
| 1073.0 | 37.919 |
| 1072.0 | 37.638 |
| 1071.0 | 37.128 |
| 1070.0 | 36.474 |
| 1069.0 | 35.822 |
| 1068.0 | 35.228 |
| 1067.0 | 34.979 |
| 1066.0 | 35.079 |
| 1065.0 | 35.493 |
| 1064.0 | 36.082 |
| 1063.0 | 36.639 |
| 1062.0 | 36.836 |
| 1061.0 | 36.547 |
| 1060.0 | 35.671 |
| 1059.0 | 34.254 |
| 1058.0 | 32.881 |
| 1057.0 | 31.585 |
| 1056.0 | 30.684 |
| 1055.0 | 30.357 |
| 1054.0 | 30.688 |
| 1053.0 | 31.71 |
| 1052.0 | 33.311 |
| 1051.0 | 35.346 |
| 1050.0 | 37.323 |
| 1049.0 | 38.655 |
| 1048.0 | 39.203 |
| 1047.0 | 38.768 |
| 1046.0 | 37.697 |
| 1045.0 | 36.304 |
| 1044.0 | 35.326 |
| 1043.0 | 34.958 |
| 1042.0 | 35.509 |
| 1041.0 | 36.952 |
| 1040.0 | 39.243 |
| 1039.0 | 42.065 |
| 1038.0 | 44.526 |
| 1037.0 | 46.336 |
| 1036.0 | 46.989 |
| 1035.0 | 46.581 |
| 1034.0 | 45.584 |
| 1033.0 | 44.759 |
| 1032.0 | 44.464 |
| 1031.0 | 44.981 |
| 1030.0 | 46.228 |
| 1029.0 | 47.891 |
| 1028.0 | 49.295 |
| 1027.0 | 50.029 |
| 1026.0 | 49.717 |
| 1025.0 | 48.514 |
| 1024.0 | 46.95 |
| 1023.0 | 45.534 |
| 1022.0 | 44.849 |
| 1021.0 | 45.006 |
| 1020.0 | 45.97 |
| 1019.0 | 47.367 |
| 1018.0 | 48.607 |
| 1017.0 | 49.041 |
| 1016.0 | 48.396 |
| 1015.0 | 46.682 |
| 1014.0 | 44.28 |
| 1013.0 | 41.944 |
| 1012.0 | 40.164 |
| 1011.0 | 39.395 |
| 1010.0 | 39.62 |
| 1009.0 | 40.77 |
| 1008.0 | 42.605 |
| 1007.0 | 44.495 |
| 1006.0 | 45.804 |
| 1005.0 | 46.234 |
| 1004.0 | 45.673 |
| 1003.0 | 44.491 |
| 1002.0 | 43.409 |
| 1001.0 | 42.974 |
| 1000.0 | 43.572 |
| 999.0 | 45.269 |
| 998.0 | 47.78 |
| 997.0 | 50.415 |
| 996.0 | 52.636 |
| 995.0 | 53.727 |
| 994.0 | 53.607 |
| 993.0 | 52.702 |
| 992.0 | 51.687 |
| 991.0 | 51.16 |
| 990.0 | 51.409 |
| 989.0 | 52.293 |
| 988.0 | 53.385 |
| 987.0 | 54.022 |
| 986.0 | 53.757 |
| 985.0 | 52.608 |
| 984.0 | 50.996 |
| 983.0 | 49.369 |
| 982.0 | 48.24 |
| 981.0 | 47.906 |
| 980.0 | 48.18 |
| 979.0 | 48.677 |
| 978.0 | 48.885 |
| 977.0 | 48.39 |
| 976.0 | 47.089 |
| 975.0 | 45.227 |
| 974.0 | 43.219 |
| 973.0 | 41.88 |
| 972.0 | 41.271 |
| 971.0 | 41.495 |
| 970.0 | 42.418 |
| 969.0 | 43.595 |
| 968.0 | 44.452 |
| 967.0 | 44.537 |
| 966.0 | 43.789 |
| 965.0 | 42.611 |
| 964.0 | 41.489 |
| 963.0 | 40.987 |
| 962.0 | 41.475 |
| 961.0 | 43.038 |
| 960.0 | 45.384 |
| 959.0 | 47.745 |
| 958.0 | 49.798 |
| 957.0 | 51.032 |
| 956.0 | 51.447 |
| 955.0 | 51.708 |
| 954.0 | 52.434 |
| 953.0 | 53.979 |
| 952.0 | 56.296 |
| 951.0 | 58.855 |
| 950.0 | 60.629 |
| 949.0 | 61.2 |
| 948.0 | 60.54 |
| 947.0 | 59.399 |
| 946.0 | 58.671 |
| 945.0 | 59.123 |
| 944.0 | 60.695 |
| 943.0 | 62.658 |
| 942.0 | 64.01 |
| 941.0 | 63.606 |
| 940.0 | 61.21 |
| 939.0 | 57.739 |
| 938.0 | 54.312 |
| 937.0 | 51.716 |
| 936.0 | 50.668 |
| 935.0 | 50.673 |
| 934.0 | 50.697 |
| 933.0 | 49.656 |
| 932.0 | 47.018 |
| 931.0 | 43.029 |
| 930.0 | 38.494 |
| 929.0 | 34.687 |
| 928.0 | 32.184 |
| 927.0 | 31.681 |
| 926.0 | 33.153 |
| 925.0 | 36.11 |
| 924.0 | 39.514 |
| 923.0 | 41.706 |
| 922.0 | 41.974 |
| 921.0 | 40.341 |
| 920.0 | 37.641 |
| 919.0 | 35.354 |
| 918.0 | 34.727 |
| 917.0 | 36.271 |
| 916.0 | 39.673 |
| 915.0 | 44.1 |
| 914.0 | 48.281 |
| 913.0 | 50.527 |
| 912.0 | 50.807 |
| 911.0 | 49.78 |
| 910.0 | 48.755 |
| 909.0 | 49.167 |
| 908.0 | 51.648 |
| 907.0 | 56.177 |
| 906.0 | 62.009 |
| 905.0 | 67.458 |
| 904.0 | 71.53 |
| 903.0 | 73.705 |
| 902.0 | 74.02 |
| 901.0 | 73.008 |
| 900.0 | 71.311 |
| 899.0 | 69.692 |
| 898.0 | 68.687 |
| 897.0 | 68.612 |
| 896.0 | 69.591 |
| 895.0 | 71.324 |
| 894.0 | 72.949 |
| 893.0 | 73.583 |
| 892.0 | 72.485 |
| 891.0 | 69.434 |
| 890.0 | 65.051 |
| 889.0 | 60.317 |
| 888.0 | 56.508 |
| 887.0 | 54.894 |
| 886.0 | 55.489 |
| 885.0 | 57.435 |
| 884.0 | 59.548 |
| 883.0 | 60.576 |
| 882.0 | 59.715 |
| 881.0 | 57.388 |
| 880.0 | 54.867 |
| 879.0 | 53.575 |
| 878.0 | 54.276 |
| 877.0 | 56.928 |
| 876.0 | 60.768 |
| 875.0 | 64.868 |
| 874.0 | 68.262 |
| 873.0 | 70.531 |
| 872.0 | 72.09 |
| 871.0 | 73.338 |
| 870.0 | 74.389 |
| 869.0 | 75.203 |
| 868.0 | 75.715 |
| 867.0 | 75.718 |
| 866.0 | 75.13 |
| 865.0 | 74.214 |
| 864.0 | 73.163 |
| 863.0 | 71.955 |
| 862.0 | 70.555 |
| 861.0 | 68.825 |
| 860.0 | 73.936 |
| 859.0 | 77.672 |
| 858.0 | 70.512 |
| 857.0 | 59.262 |
| 856.0 | 50.075 |
| 855.0 | 46.147 |
| 854.0 | 47.621 |
| 853.0 | 53.137 |
| 852.0 | 59.635 |
| 851.0 | 62.769 |
| 850.0 | 60.215 |
| 849.0 | 54.187 |
| 848.0 | 49.194 |
| 847.0 | 48.517 |
| 846.0 | 53.657 |
| 845.0 | 64.303 |
| 844.0 | 77.014 |
| 843.0 | 85.563 |
| 842.0 | 85.847 |
| 841.0 | 80.234 |
| 840.0 | 74.622 |
| 839.0 | 73.188 |
| 838.0 | 76.586 |
| 837.0 | 82.822 |
| 836.0 | 88.504 |
| 835.0 | 91.402 |
| 834.0 | 92.326 |
| 833.0 | 93.302 |
| 832.0 | 95.062 |
| 831.0 | 96.057 |
| 830.0 | 93.691 |
| 829.0 | 87.307 |
| 828.0 | 79.607 |
| 827.0 | 74.325 |
| 826.0 | 73.816 |
| 825.0 | 78.031 |
| 824.0 | 84.218 |
| 823.0 | 87.879 |
| 822.0 | 86.176 |
| 821.0 | 80.216 |
| 820.0 | 73.961 |
| 819.0 | 71.043 |
| 818.0 | 72.93 |
| 817.0 | 78.872 |
| 816.0 | 86.263 |
| 815.0 | 91.607 |
| 814.0 | 93.13 |
| 813.0 | 92.092 |
| 812.0 | 90.988 |
| 811.0 | 91.374 |
| 810.0 | 93.375 |
| 809.0 | 95.88 |
| 808.0 | 97.516 |
| 807.0 | 98.038 |
| 806.0 | 98.055 |
| 805.0 | 98.168 |
| 804.0 | 98.586 |
| 803.0 | 98.981 |
| 802.0 | 99.091 |
| 801.0 | 99.124 |
| 800.0 | 99.174 |
| 799.0 | 99.307 |
| 798.0 | 99.399 |
| 797.0 | 99.117 |
| 796.0 | 98.599 |
| 795.0 | 98.334 |
| 794.0 | 98.512 |
| 793.0 | 98.979 |
| 792.0 | 99.361 |
| 791.0 | 99.216 |
| 790.0 | 98.571 |
| 789.0 | 98.044 |
| 788.0 | 98.098 |
| 787.0 | 98.618 |
| 786.0 | 99.095 |
| 785.0 | 99.008 |
| 784.0 | 98.392 |
| 783.0 | 97.904 |
| 782.0 | 97.941 |
| 781.0 | 98.387 |
| 780.0 | 98.992 |
| 779.0 | 99.223 |
| 778.0 | 99.052 |
| 777.0 | 98.942 |
| 776.0 | 99.044 |
| 775.0 | 99.265 |
| 774.0 | 99.406 |
| 773.0 | 99.186 |
| 772.0 | 98.863 |
| 771.0 | 98.849 |
| 770.0 | 99.107 |
| 769.0 | 99.339 |
| 768.0 | 99.331 |
| 767.0 | 98.983 |
| 766.0 | 98.658 |
| 765.0 | 98.745 |
| 764.0 | 99.11 |
| 763.0 | 99.376 |
| 762.0 | 99.363 |
| 761.0 | 99.108 |
| 760.0 | 98.92 |
| 759.0 | 99.104 |
| 758.0 | 99.425 |
| 757.0 | 99.443 |
| 756.0 | 99.362 |
| 755.0 | 99.283 |
| 754.0 | 99.296 |
| 753.0 | 99.39 |
| 752.0 | 99.173 |
| 751.0 | 98.599 |
| 750.0 | 98.15 |
| 749.0 | 98.185 |
| 748.0 | 98.614 |
| 747.0 | 99.166 |
| 746.0 | 99.306 |
| 745.0 | 99.028 |
| 744.0 | 98.871 |
| 743.0 | 98.981 |
| 742.0 | 99.135 |
| 741.0 | 99.296 |
| 740.0 | 99.225 |
| 739.0 | 99.102 |
| 738.0 | 99.237 |
| 737.0 | 99.451 |
| 736.0 | 99.493 |
| 735.0 | 99.476 |
| 734.0 | 99.441 |
| 733.0 | 99.439 |
| 732.0 | 99.48 |
| 731.0 | 99.233 |
| 730.0 | 98.829 |
| 729.0 | 98.698 |
| 728.0 | 98.929 |
| 727.0 | 99.294 |
| 726.0 | 99.486 |
| 725.0 | 99.396 |
| 724.0 | 99.28 |
| 723.0 | 99.467 |
| 722.0 | 99.548 |
| 721.0 | 99.353 |
| 720.0 | 99.102 |
| 719.0 | 98.974 |
| 718.0 | 99.173 |
| 717.0 | 99.476 |
| 716.0 | 99.381 |
| 715.0 | 98.987 |
| 714.0 | 98.927 |
| 713.0 | 99.2 |
| 712.0 | 99.42 |
| 711.0 | 99.429 |
| 710.0 | 99.12 |
| 709.0 | 99.417 |
| 708.0 | 99.712 |
| 707.0 | 99.625 |
| 706.0 | 98.518 |
| 705.0 | 98.452 |
| 704.0 | 98.142 |
| 703.0 | 99.012 |
| 702.0 | 99.491 |
| 701.0 | 99.268 |
| 700.0 | 98.491 |
| 699.0 | 98.791 |
| 698.0 | 99.551 |
| 697.0 | 99.997 |
| 696.0 | 98.803 |
| 695.0 | 99.152 |
| 694.0 | 99.293 |
| 693.0 | 99.276 |
| 692.0 | 98.884 |
| 691.0 | 99.032 |
| 690.0 | 99.521 |
| 689.0 | 99.459 |
| 688.0 | 98.591 |
| 687.0 | 98.143 |
| 686.0 | 98.577 |
| 685.0 | 99.94 |
| 684.0 | 99.533 |
| 683.0 | 98.907 |
| 682.0 | 98.477 |
| 681.0 | 98.874 |
| 680.0 | 99.057 |
| 679.0 | 99.399 |
| 678.0 | 98.788 |
| 677.0 | 99.599 |
| 676.0 | 99.432 |
| 675.0 | 98.846 |
| 674.0 | 98.935 |
| 673.0 | 98.789 |
| 672.0 | 99.068 |
| 671.0 | 98.963 |
| 670.0 | 98.567 |
| 669.0 | 98.775 |
| 668.0 | 99.19 |
| 667.0 | 99.136 |
| 666.0 | 98.9 |
| 665.0 | 98.517 |
| 664.0 | 99.07 |
| 663.0 | 99.727 |
| 662.0 | 99.002 |
| 661.0 | 98.181 |
| 660.0 | 98.917 |
| 659.0 | 99.185 |
| 658.0 | 99.046 |
| 657.0 | 99.232 |
| 656.0 | 98.906 |
| 655.0 | 99.779 |
| 654.0 | 99.907 |
| 653.0 | 99.101 |
| 652.0 | 98.924 |
| 651.0 | 99.242 |
| 650.0 | 98.617 |
| 649.0 | 98.152 |
| 648.0 | 98.964 |
| 647.0 | 99.174 |
| 646.0 | 98.62 |
| 645.0 | 98.609 |
| 644.0 | 99.337 |
| 643.0 | 99.551 |
| 642.0 | 99.645 |
| 641.0 | 99.702 |
| 640.0 | 99.197 |
| 639.0 | 99.494 |
| 638.0 | 99.213 |
| 637.0 | 99.293 |
| 636.0 | 99.457 |
| 635.0 | 99.39 |
| 634.0 | 99.424 |
| 633.0 | 99.93 |
| 632.0 | 98.468 |
| 631.0 | 97.799 |
| 630.0 | 98.632 |
| 629.0 | 99.178 |
| 628.0 | 99.575 |
| 627.0 | 99.427 |
| 626.0 | 99.081 |
| 625.0 | 99.561 |
| 624.0 | 99.939 |
| 623.0 | 99.387 |
| 622.0 | 99.849 |
| 621.0 | 99.839 |
| 620.0 | 99.236 |
| 619.0 | 99.484 |
| 618.0 | 99.644 |
| 617.0 | 99.332 |
| 616.0 | 98.962 |
| 615.0 | 99.36 |
| 614.0 | 99.263 |
| 613.0 | 98.238 |
| 612.0 | 98.384 |
| 611.0 | 99.138 |
| 610.0 | 99.519 |
| 609.0 | 99.451 |
| 608.0 | 99.785 |
| 607.0 | 98.784 |
| 606.0 | 98.993 |
| 605.0 | 99.233 |
| 604.0 | 99.377 |
| 603.0 | 99.29 |
| 602.0 | 98.667 |
| 601.0 | 98.885 |
| 600.0 | 99.377 |
| 599.0 | 98.64 |
| 598.0 | 98.725 |
| 597.0 | 99.57 |
| 596.0 | 98.974 |
| 595.0 | 98.315 |
| 594.0 | 98.491 |
| 593.0 | 98.791 |
| 592.0 | 99.113 |
| 591.0 | 98.6 |
| 590.0 | 98.227 |
| 589.0 | 98.893 |
| 588.0 | 99.071 |
| 587.0 | 98.178 |
| 586.0 | 98.202 |
| 585.0 | 98.435 |
| 584.0 | 98.323 |
| 583.0 | 98.506 |
| 582.0 | 98.839 |
| 581.0 | 98.758 |
| 580.0 | 98.337 |
| 579.0 | 98.729 |
| 578.0 | 98.966 |
| 577.0 | 98.807 |
| 576.0 | 98.64 |
| 575.0 | 98.698 |
| 574.0 | 98.486 |
| 573.0 | 98.502 |
| 572.0 | 98.645 |
| 571.0 | 98.151 |
| 570.0 | 98.102 |
| 569.0 | 98.501 |
| 568.0 | 97.94 |
| 567.0 | 97.905 |
| 566.0 | 97.864 |
| 565.0 | 97.683 |
| 564.0 | 98.225 |
| 563.0 | 98.164 |
| 562.0 | 97.936 |
| 561.0 | 98.177 |
| 560.0 | 97.875 |
| 559.0 | 97.906 |
| 558.0 | 98.439 |
| 557.0 | 97.758 |
| 556.0 | 97.634 |
| 555.0 | 97.437 |
| 554.0 | 96.746 |
| 553.0 | 97.882 |
| 552.0 | 98.964 |
| 551.0 | 98.914 |
| 550.0 | 98.039 |
| 549.0 | 97.778 |
| 548.0 | 98.854 |
| 547.0 | 98.448 |
| 546.0 | 97.389 |
| 545.0 | 95.623 |
| 544.0 | 90.112 |
| 543.0 | 73.706 |
| 542.0 | 44.236 |
| 541.0 | 14.555 |
| 540.0 | 0.224 |
| 539.0 | 0.027 |
| 538.0 | 0.005 |
| 537.0 | 0.001 |
| 536.0 | 0 |
| 535.0 | 0 |
| 534.0 | 0 |
| 533.0 | 0 |
| 532.0 | 0 |
| 531.0 | 0 |
| 530.0 | 0.005 |
| 529.0 | 0.034 |
| 528.0 | 0.482 |
| 527.0 | 14.976 |
| 526.0 | 58.063 |
| 525.0 | 92.408 |
| 524.0 | 96.076 |
| 523.0 | 96.144 |
| 522.0 | 97.398 |
| 521.0 | 98.174 |
| 520.0 | 98.652 |
| 519.0 | 98.577 |
| 518.0 | 98.33 |
| 517.0 | 98.089 |
| 516.0 | 97.974 |
| 515.0 | 96.982 |
| 514.0 | 95.873 |
| 513.0 | 96.485 |
| 512.0 | 96.426 |
| 511.0 | 96.615 |
| 510.0 | 96.665 |
| 509.0 | 96.722 |
| 508.0 | 96.898 |
| 507.0 | 97.103 |
| 506.0 | 97.128 |
| 505.0 | 97.063 |
| 504.0 | 97.359 |
| 503.0 | 97.49 |
| 502.0 | 97.218 |
| 501.0 | 97.108 |
| 500.0 | 97.209 |
| 499.0 | 97.085 |
| 498.0 | 97.703 |
| 497.0 | 97.909 |
| 496.0 | 97.36 |
| 495.0 | 97.294 |
| 494.0 | 97.519 |
| 493.0 | 97.649 |
| 492.0 | 97.912 |
| 491.0 | 97.974 |
| 490.0 | 97.816 |
| 489.0 | 97.94 |
| 488.0 | 98.059 |
| 487.0 | 98.02 |
| 486.0 | 97.716 |
| 485.0 | 97.84 |
| 484.0 | 98.079 |
| 483.0 | 98.072 |
| 482.0 | 98.122 |
| 481.0 | 98.268 |
| 480.0 | 98.131 |
| 479.0 | 97.886 |
| 478.0 | 97.424 |
| 477.0 | 97.552 |
| 476.0 | 97.907 |
| 475.0 | 98.283 |
| 474.0 | 97.83 |
| 473.0 | 97.661 |
| 472.0 | 98.016 |
| 471.0 | 98.067 |
| 470.0 | 97.96 |
| 469.0 | 97.274 |
| 468.0 | 96.816 |
| 467.0 | 97.028 |
| 466.0 | 97.544 |
| 465.0 | 97.852 |
| 464.0 | 97.498 |
| 463.0 | 97.067 |
| 462.0 | 97.209 |
| 461.0 | 96.859 |
| 460.0 | 96.835 |
| 459.0 | 97.272 |
| 458.0 | 97.771 |
| 457.0 | 97.377 |
| 456.0 | 97.027 |
| 455.0 | 97.082 |
| 454.0 | 96.911 |
| 453.0 | 97.136 |
| 452.0 | 97.569 |
| 451.0 | 97.386 |
| 450.0 | 97.474 |
| 449.0 | 97.047 |
| 448.0 | 96.321 |
| 447.0 | 96.329 |
| 446.0 | 96.571 |
| 445.0 | 96.687 |
| 444.0 | 96.835 |
| 443.0 | 97.274 |
| 442.0 | 96.664 |
| 441.0 | 96.78 |
| 440.0 | 97.131 |
| 439.0 | 97.225 |
| 438.0 | 96.525 |
| 437.0 | 96.511 |
| 436.0 | 96.105 |
| 435.0 | 95.834 |
| 434.0 | 95.808 |
| 433.0 | 96.033 |
| 432.0 | 97.142 |
| 431.0 | 96.585 |
| 430.0 | 95.568 |
| 429.0 | 95.785 |
| 428.0 | 96.001 |
| 427.0 | 96.261 |
| 426.0 | 96.137 |
| 425.0 | 95.739 |
| 424.0 | 95.589 |
| 423.0 | 95.791 |
| 422.0 | 95.822 |
| 421.0 | 96.318 |
| 420.0 | 96.165 |
| 419.0 | 95.876 |
| 418.0 | 95.866 |
| 417.0 | 96.007 |
| 416.0 | 95.968 |
| 415.0 | 94.84 |
| 414.0 | 94.588 |
| 413.0 | 94.53 |
| 412.0 | 94.64 |
| 411.0 | 93.816 |
| 410.0 | 93.942 |
| 409.0 | 93.795 |
| 408.0 | 92.931 |
| 407.0 | 92.936 |
| 406.0 | 92.727 |
| 405.0 | 92.704 |
| 404.0 | 92.857 |
| 403.0 | 91.523 |
| 402.0 | 90.589 |
| 401.0 | 90.357 |
| 400.0 | 90.538 |
| 399.0 | 86.887 |
| 398.0 | 86.429 |
| 397.0 | 85.664 |
| 396.0 | 84.636 |
| 395.0 | 83.255 |
| 394.0 | 81.36 |
| 393.0 | 79.146 |
| 392.0 | 77.319 |
| 391.0 | 76.082 |
| 390.0 | 74.832 |
| 389.0 | 72.391 |
| 388.0 | 64.832 |
| 387.0 | 49.433 |
| 386.0 | 30.631 |
| 385.0 | 15.417 |
| 384.0 | 6.371 |
| 383.0 | 2.072 |
| 382.0 | 0.472 |
| 381.0 | 0.062 |
| 380.0 | 0.004 |
| 379.0 | 0.001 |
| 378.0 | 0.004 |
| 377.0 | 0.004 |
| 376.0 | 0.003 |
| 375.0 | 0.002 |
| 374.0 | 0.003 |
| 373.0 | 0.001 |
| 372.0 | 0.001 |
| 371.0 | 0.004 |
| 370.0 | 0.005 |
| 369.0 | 0.002 |
| 368.0 | 0.003 |
| 367.0 | 0.001 |
| 366.0 | 0 |
| 365.0 | 0.004 |
| 364.0 | 0.005 |
| 363.0 | 0.002 |
| 362.0 | 0.003 |
| 361.0 | 0.002 |
| 360.0 | 0.001 |
| 359.0 | 0.005 |
| 358.0 | 0.006 |
| 357.0 | 0.006 |
| 356.0 | 0.005 |
| 355.0 | 0.004 |
| 354.0 | 0.001 |
| 353.0 | 0.005 |
| 352.0 | 0.006 |
| 351.0 | 0.002 |
| 350.0 | 0.005 |
| 349.0 | 0.001 |
| 348.0 | 0.001 |
| 347.0 | 0.005 |
| 346.0 | 0.005 |
| 345.0 | 0.005 |
| 344.0 | 0.005 |
| 343.0 | 0.002 |
| 342.0 | 0.001 |
| 341.0 | 0.004 |
| 340.0 | 0.007 |
| 339.0 | 0.005 |
| 338.0 | 0.004 |
| 337.0 | 0.001 |
| 336.0 | 0.001 |
| 335.0 | 0.005 |
| 334.0 | 0.006 |
| 333.0 | 0.002 |
| 332.0 | 0.005 |
| 331.0 | 0.002 |
| 330.0 | 0.002 |
| 329.0 | 0.004 |
| 328.0 | 0.006 |
| 327.0 | 0.004 |
| 326.0 | 0.005 |
| 325.0 | 0.002 |
| 324.0 | 0.002 |
| 323.0 | 0.004 |
| 322.0 | 0.007 |
| 321.0 | 0.001 |
| 320.0 | 0.006 |
| 319.0 | 0.001 |
| 318.0 | 0.003 |
| 317.0 | 0.006 |
| 316.0 | 0.005 |
| 315.0 | 0.003 |
| 314.0 | 0.004 |
| 313.0 | 0.002 |
| 312.0 | 0 |
| 311.0 | 0.004 |
| 310.0 | 0.006 |
| 309.0 | 0.002 |
| 308.0 | 0.004 |
| 307.0 | 0.003 |
| 306.0 | 0 |
| 305.0 | 0.005 |
| 304.0 | 0.005 |
| 303.0 | 0.003 |
| 302.0 | 0.004 |
| 301.0 | 0.001 |
| 300.0 | 0 |
| 299.0 | 0.004 |
| 298.0 | 0.005 |
| 297.0 | 0.003 |
| 296.0 | 0.004 |
| 295.0 | 0.001 |
| 294.0 | 0.001 |
| 293.0 | 0.004 |
| 292.0 | 0.006 |
| 291.0 | 0.002 |
| 290.0 | 0.006 |
| 289.0 | 0.001 |
| 288.0 | 0.001 |
| 287.0 | 0.005 |
| 286.0 | 0.006 |
| 285.0 | 0.003 |
| 284.0 | 0.006 |
| 283.0 | 0 |
| 282.0 | 0.002 |
| 281.0 | 0.004 |
| 280.0 | 0.007 |
| 279.0 | 0 |
| 278.0 | 0.006 |
| 277.0 | 0 |
| 276.0 | 0.001 |
| 275.0 | 0.004 |
| 274.0 | 0.006 |
| 273.0 | 0.001 |
| 272.0 | 0.007 |
| 271.0 | 0 |
| 270.0 | 0.004 |
| 269.0 | 0.005 |
| 268.0 | 0.006 |
| 267.0 | 0.003 |
| 266.0 | 0.003 |
| 265.0 | 0.001 |
| 264.0 | 0.002 |
| 263.0 | 0.005 |
| 262.0 | 0.006 |
| 261.0 | 0.003 |
| 260.0 | 0.007 |
| 259.0 | 0 |
| 258.0 | 0.001 |
| 257.0 | 0.006 |
| 256.0 | 0.007 |
| 255.0 | 0.006 |
| 254.0 | 0.005 |
| 253.0 | 0.001 |
| 252.0 | 0.002 |
| 251.0 | 0.006 |
| 250.0 | 0.008 |
| 249.0 | 0.002 |
| 248.0 | 0.006 |
| 247.0 | 0.001 |
| 246.0 | 0 |
| 245.0 | 0.006 |
| 244.0 | 0.006 |
| 243.0 | 0.003 |
| 242.0 | 0.005 |
| 241.0 | 0.001 |
| 240.0 | 0.002 |
| 239.0 | 0.006 |
| 238.0 | 0.007 |
| 237.0 | 0.004 |
| 236.0 | 0.003 |
| 235.0 | 0.002 |
| 234.0 | 0.001 |
| 233.0 | 0.007 |
| 232.0 | 0.006 |
| 231.0 | 0.004 |
| 230.0 | 0.005 |
| 229.0 | 0.002 |
| 228.0 | 0.002 |
| 227.0 | 0.007 |
| 226.0 | 0.005 |
| 225.0 | 0.004 |
| 224.0 | 0.005 |
| 223.0 | 0.003 |
| 222.0 | 0.002 |
| 221.0 | 0.006 |
| 220.0 | 0.006 |
| 219.0 | 0.004 |
| 218.0 | 0.004 |
| 217.0 | 0.002 |
| 216.0 | 0.002 |
| 215.0 | 0.008 |
| 214.0 | 0.006 |
| 213.0 | 0.005 |
| 212.0 | 0.006 |
| 211.0 | 0.002 |
| 210.0 | 0.004 |
| 209.0 | 0.007 |
| 208.0 | 0.008 |
| 207.0 | 0.004 |
| 206.0 | 0.006 |
| 205.0 | 0.003 |
| 204.0 | 0.005 |
| 203.0 | 0.01 |
| 202.0 | 0.01 |
| 201.0 | 0.006 |
| 200.0 | 0.011 |